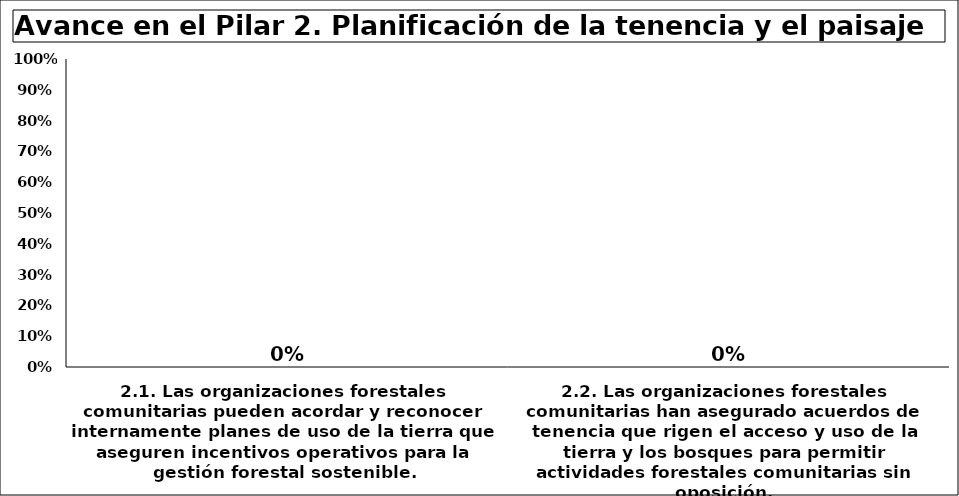
| Category | Series 6 |
|---|---|
| 2.1. Las organizaciones forestales comunitarias pueden acordar y reconocer internamente planes de uso de la tierra que aseguren incentivos operativos para la gestión forestal sostenible. | 0 |
| 2.2. Las organizaciones forestales comunitarias han asegurado acuerdos de tenencia que rigen el acceso y uso de la tierra y los bosques para permitir actividades forestales comunitarias sin oposición.  | 0 |